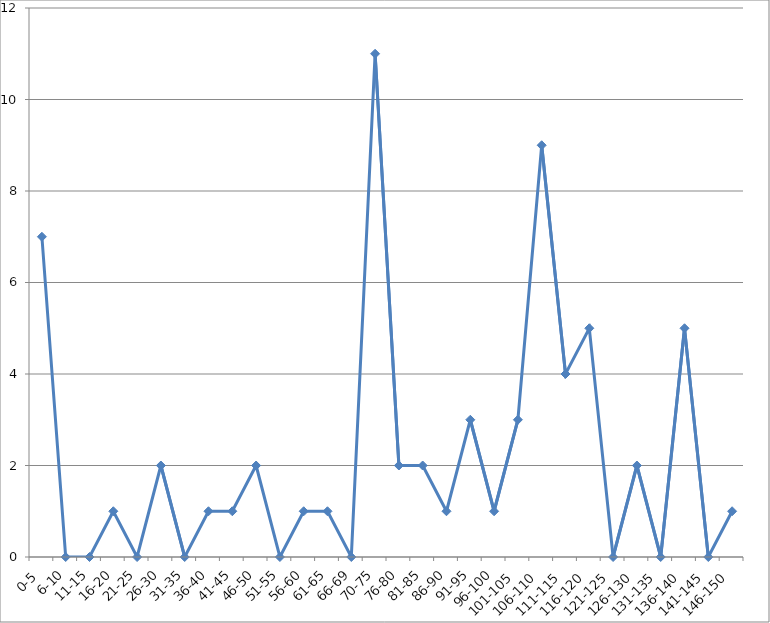
| Category | Series 0 |
|---|---|
| 0-5 | 7 |
| 6-10 | 0 |
| 11-15 | 0 |
| 16-20 | 1 |
| 21-25 | 0 |
| 26-30 | 2 |
| 31-35 | 0 |
| 36-40 | 1 |
| 41-45 | 1 |
| 46-50 | 2 |
| 51-55 | 0 |
| 56-60 | 1 |
| 61-65 | 1 |
| 66-69 | 0 |
| 70-75 | 11 |
| 76-80 | 2 |
| 81-85 | 2 |
| 86-90 | 1 |
| 91-95 | 3 |
| 96-100 | 1 |
| 101-105 | 3 |
| 106-110 | 9 |
| 111-115 | 4 |
| 116-120 | 5 |
| 121-125 | 0 |
| 126-130 | 2 |
| 131-135 | 0 |
| 136-140 | 5 |
| 141-145 | 0 |
| 146-150 | 1 |